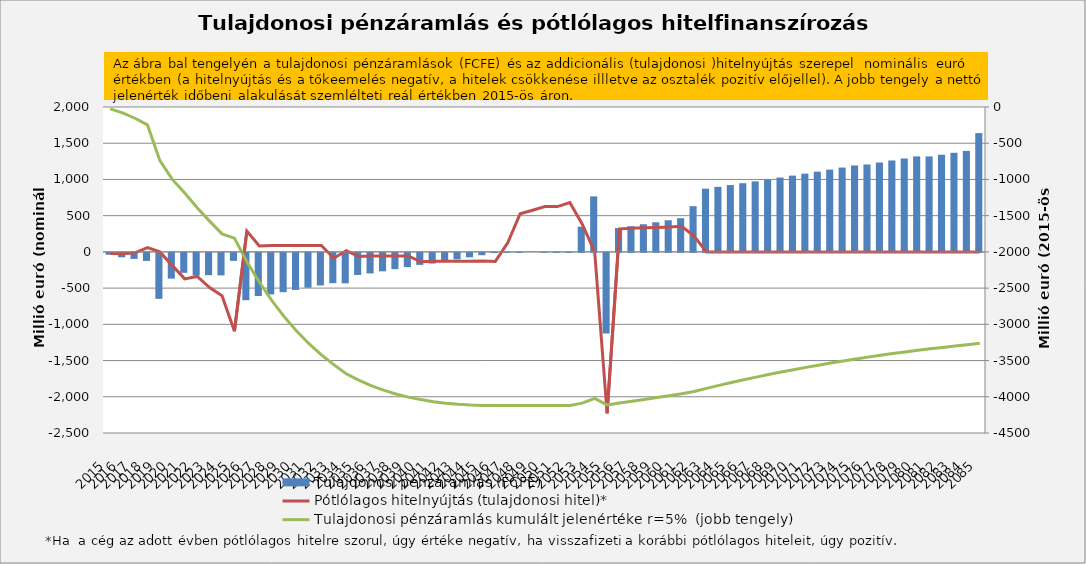
| Category | Tulajdonosi pénzáramlás (FCFE) |
|---|---|
| 2015.0 | -25 |
| 2016.0 | -60.742 |
| 2017.0 | -82.947 |
| 2018.0 | -111.256 |
| 2019.0 | -634.105 |
| 2020.0 | -355.777 |
| 2021.0 | -275 |
| 2022.0 | -312.5 |
| 2023.0 | -307.5 |
| 2024.0 | -310 |
| 2025.0 | -110 |
| 2026.0 | -653.222 |
| 2027.0 | -595.121 |
| 2028.0 | -573.19 |
| 2029.0 | -542.404 |
| 2030.0 | -511.498 |
| 2031.0 | -480.47 |
| 2032.0 | -449.317 |
| 2033.0 | -418.037 |
| 2034.0 | -420.364 |
| 2035.0 | -304.543 |
| 2036.0 | -283.371 |
| 2037.0 | -254.151 |
| 2038.0 | -224.776 |
| 2039.0 | -195.244 |
| 2040.0 | -165.553 |
| 2041.0 | -146.687 |
| 2042.0 | -118.223 |
| 2043.0 | -89.593 |
| 2044.0 | -60.795 |
| 2045.0 | -31.825 |
| 2046.0 | -2.681 |
| 2047.0 | 0 |
| 2048.0 | 0 |
| 2049.0 | 0 |
| 2050.0 | 0 |
| 2051.0 | 0 |
| 2052.0 | 0 |
| 2053.0 | 347.367 |
| 2054.0 | 765.701 |
| 2055.0 | -1113.068 |
| 2056.0 | 328.347 |
| 2057.0 | 354.694 |
| 2058.0 | 381.533 |
| 2059.0 | 408.872 |
| 2060.0 | 436.719 |
| 2061.0 | 465.084 |
| 2062.0 | 631.013 |
| 2063.0 | 872.942 |
| 2064.0 | 897.579 |
| 2065.0 | 922.566 |
| 2066.0 | 947.909 |
| 2067.0 | 973.613 |
| 2068.0 | 999.682 |
| 2069.0 | 1026.123 |
| 2070.0 | 1052.941 |
| 2071.0 | 1080.141 |
| 2072.0 | 1107.729 |
| 2073.0 | 1135.71 |
| 2074.0 | 1164.091 |
| 2075.0 | 1192.877 |
| 2076.0 | 1206.581 |
| 2077.0 | 1233.862 |
| 2078.0 | 1261.55 |
| 2079.0 | 1289.653 |
| 2080.0 | 1318.175 |
| 2081.0 | 1317.541 |
| 2082.0 | 1342.466 |
| 2083.0 | 1367.801 |
| 2084.0 | 1393.55 |
| 2085.0 | 1639.679 |